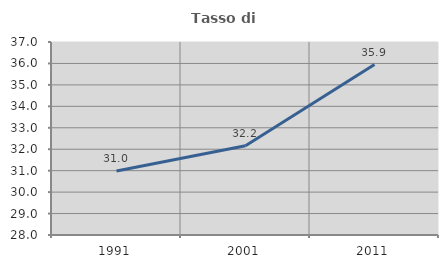
| Category | Tasso di occupazione   |
|---|---|
| 1991.0 | 30.983 |
| 2001.0 | 32.16 |
| 2011.0 | 35.947 |